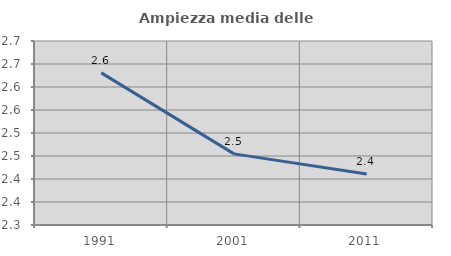
| Category | Ampiezza media delle famiglie |
|---|---|
| 1991.0 | 2.631 |
| 2001.0 | 2.455 |
| 2011.0 | 2.411 |